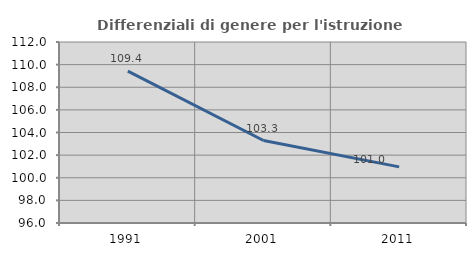
| Category | Differenziali di genere per l'istruzione superiore |
|---|---|
| 1991.0 | 109.426 |
| 2001.0 | 103.292 |
| 2011.0 | 100.96 |